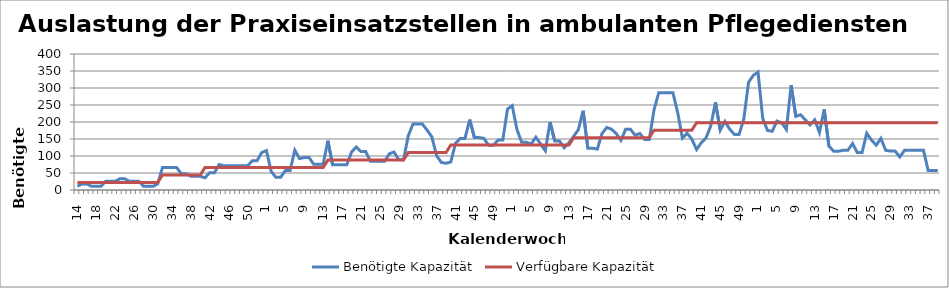
| Category | Benötigte Kapazität | Verfügbare Kapazität |
|---|---|---|
| 14.0 | 10.8 | 22 |
| 15.0 | 18 | 22 |
| 16.0 | 18 | 22 |
| 17.0 | 10.8 | 22 |
| 18.0 | 10.8 | 22 |
| 19.0 | 10.8 | 22 |
| 20.0 | 25.8 | 22 |
| 21.0 | 25.8 | 22 |
| 22.0 | 25.8 | 22 |
| 23.0 | 33 | 22 |
| 24.0 | 33 | 22 |
| 25.0 | 25.8 | 22 |
| 26.0 | 25.8 | 22 |
| 27.0 | 25.8 | 22 |
| 28.0 | 10.8 | 22 |
| 29.0 | 10.8 | 22 |
| 30.0 | 10.8 | 22 |
| 31.0 | 18 | 22 |
| 32.0 | 66 | 44 |
| 33.0 | 66 | 44 |
| 34.0 | 66 | 44 |
| 35.0 | 66 | 44 |
| 36.0 | 48 | 44 |
| 37.0 | 48 | 44 |
| 38.0 | 40.2 | 44 |
| 39.0 | 40.2 | 44 |
| 40.0 | 40.2 | 44 |
| 41.0 | 36 | 66 |
| 42.0 | 51 | 66 |
| 43.0 | 51 | 66 |
| 44.0 | 75 | 66 |
| 45.0 | 71 | 66 |
| 46.0 | 71 | 66 |
| 47.0 | 71 | 66 |
| 48.0 | 71 | 66 |
| 49.0 | 71 | 66 |
| 50.0 | 71 | 66 |
| 51.0 | 86 | 66 |
| 52.0 | 86 | 66 |
| 53.0 | 110 | 66 |
| 1.0 | 116 | 66 |
| 2.0 | 54.6 | 66 |
| 3.0 | 37.2 | 66 |
| 4.0 | 37.2 | 66 |
| 5.0 | 57.2 | 66 |
| 6.0 | 57.2 | 66 |
| 7.0 | 117 | 66 |
| 8.0 | 92.2 | 66 |
| 9.0 | 95.8 | 66 |
| 10.0 | 95.8 | 66 |
| 11.0 | 75.8 | 66 |
| 12.0 | 75.8 | 66 |
| 13.0 | 75.8 | 66 |
| 14.0 | 145 | 88 |
| 15.0 | 74 | 88 |
| 16.0 | 74 | 88 |
| 17.0 | 74 | 88 |
| 18.0 | 74 | 88 |
| 19.0 | 111.6 | 88 |
| 20.0 | 126.6 | 88 |
| 21.0 | 113 | 88 |
| 22.0 | 113 | 88 |
| 23.0 | 84.2 | 88 |
| 24.0 | 84.2 | 88 |
| 25.0 | 84.2 | 88 |
| 26.0 | 84.2 | 88 |
| 27.0 | 106.6 | 88 |
| 28.0 | 111.6 | 88 |
| 29.0 | 89.2 | 88 |
| 30.0 | 89.2 | 88 |
| 31.0 | 159 | 110 |
| 32.0 | 194 | 110 |
| 33.0 | 194 | 110 |
| 34.0 | 194 | 110 |
| 35.0 | 176 | 110 |
| 36.0 | 156 | 110 |
| 37.0 | 101 | 110 |
| 38.0 | 81 | 110 |
| 39.0 | 78.6 | 110 |
| 40.0 | 82.4 | 132 |
| 41.0 | 137.4 | 132 |
| 42.0 | 151.8 | 132 |
| 43.0 | 151.8 | 132 |
| 44.0 | 207 | 132 |
| 45.0 | 154.2 | 132 |
| 46.0 | 154.2 | 132 |
| 47.0 | 151.8 | 132 |
| 48.0 | 131.8 | 132 |
| 49.0 | 131.8 | 132 |
| 50.0 | 146.8 | 132 |
| 51.0 | 146.8 | 132 |
| 52.0 | 238 | 132 |
| 1.0 | 248 | 132 |
| 2.0 | 177.8 | 132 |
| 3.0 | 140.4 | 132 |
| 4.0 | 140.4 | 132 |
| 5.0 | 135.4 | 132 |
| 6.0 | 155.4 | 132 |
| 7.0 | 135.4 | 132 |
| 8.0 | 115.4 | 132 |
| 9.0 | 200 | 132 |
| 10.0 | 144 | 132 |
| 11.0 | 144 | 132 |
| 12.0 | 124 | 132 |
| 13.0 | 139 | 132 |
| 14.0 | 157.8 | 154 |
| 15.0 | 177.8 | 154 |
| 16.0 | 233 | 154 |
| 17.0 | 122.8 | 154 |
| 18.0 | 122.8 | 154 |
| 19.0 | 120.4 | 154 |
| 20.0 | 166.2 | 154 |
| 21.0 | 183.8 | 154 |
| 22.0 | 178.8 | 154 |
| 23.0 | 166 | 154 |
| 24.0 | 146 | 154 |
| 25.0 | 178.8 | 154 |
| 26.0 | 178.8 | 154 |
| 27.0 | 161.2 | 154 |
| 28.0 | 166.2 | 154 |
| 29.0 | 148.8 | 154 |
| 30.0 | 148.8 | 154 |
| 31.0 | 236 | 176 |
| 32.0 | 286 | 176 |
| 33.0 | 286 | 176 |
| 34.0 | 286 | 176 |
| 35.0 | 286 | 176 |
| 36.0 | 228 | 176 |
| 37.0 | 152.6 | 176 |
| 38.0 | 167 | 176 |
| 39.0 | 149.6 | 176 |
| 40.0 | 119 | 198 |
| 41.0 | 139 | 198 |
| 42.0 | 153.4 | 198 |
| 43.0 | 188.4 | 198 |
| 44.0 | 258 | 198 |
| 45.0 | 175.8 | 198 |
| 46.0 | 201.6 | 198 |
| 47.0 | 179.2 | 198 |
| 48.0 | 163.4 | 198 |
| 49.0 | 163.4 | 198 |
| 50.0 | 209.2 | 198 |
| 51.0 | 317 | 198 |
| 52.0 | 337 | 198 |
| 1.0 | 347 | 198 |
| 2.0 | 210.2 | 198 |
| 3.0 | 175.2 | 198 |
| 4.0 | 172.8 | 198 |
| 5.0 | 202.8 | 198 |
| 6.0 | 197.8 | 198 |
| 7.0 | 177.8 | 198 |
| 8.0 | 308 | 198 |
| 9.0 | 216.4 | 198 |
| 10.0 | 221.4 | 198 |
| 11.0 | 206.4 | 198 |
| 12.0 | 191.4 | 198 |
| 13.0 | 206.4 | 198 |
| 14.0 | 169.2 | 198 |
| 15.0 | 237 | 198 |
| 16.0 | 129.2 | 198 |
| 17.0 | 114.2 | 198 |
| 18.0 | 114.2 | 198 |
| 19.0 | 116.8 | 198 |
| 20.0 | 116.8 | 198 |
| 21.0 | 136.8 | 198 |
| 22.0 | 110 | 198 |
| 23.0 | 110 | 198 |
| 24.0 | 166.8 | 198 |
| 25.0 | 146.8 | 198 |
| 26.0 | 131.8 | 198 |
| 27.0 | 151.8 | 198 |
| 28.0 | 116.8 | 198 |
| 29.0 | 114.4 | 198 |
| 30.0 | 114.4 | 198 |
| 31.0 | 97 | 198 |
| 32.0 | 117 | 198 |
| 33.0 | 117 | 198 |
| 34.0 | 117 | 198 |
| 35.0 | 117 | 198 |
| 36.0 | 117 | 198 |
| 37.0 | 57.2 | 198 |
| 38.0 | 57.2 | 198 |
| 39.0 | 57.2 | 198 |